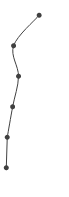
| Category | Series 0 |
|---|---|
| 0.5432176012108844 | 1 |
| 0.12267662500709084 | 2 |
| 0.2041008051300714 | 3 |
| 0.10760061155339963 | 4 |
| 0.019074111262695526 | 5 |
| 0.003296287909417779 | 6 |